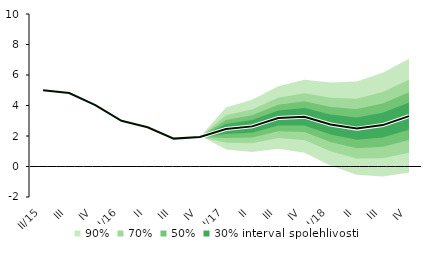
| Category | linka | Centerline |
|---|---|---|
| II/15 | 5.004 | 5.004 |
| III | 4.815 | 4.815 |
| IV | 4.027 | 4.027 |
| I/16 | 2.997 | 2.997 |
| II | 2.57 | 2.57 |
| III | 1.828 | 1.828 |
| IV | 1.935 | 1.935 |
| I/17 | 2.459 | 2.459 |
| II | 2.631 | 2.631 |
| III | 3.184 | 3.184 |
| IV | 3.267 | 3.267 |
| I/18 | 2.756 | 2.756 |
| II | 2.485 | 2.485 |
| III | 2.715 | 2.715 |
| IV | 3.301 | 3.301 |